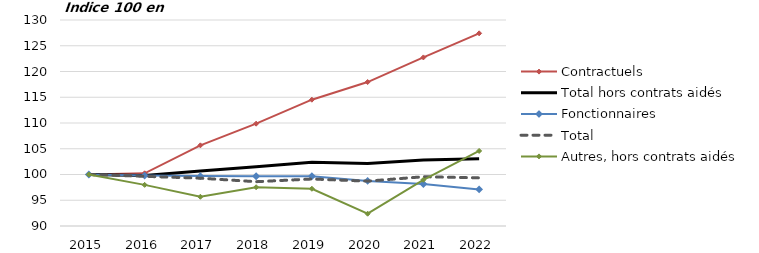
| Category | Contractuels | Total hors contrats aidés | Fonctionnaires | Total  | Autres, hors contrats aidés |
|---|---|---|---|---|---|
| 2015.0 | 100 | 100 | 100 | 100 | 100 |
| 2016.0 | 100.229 | 99.816 | 99.791 | 99.645 | 97.986 |
| 2017.0 | 105.657 | 100.684 | 99.69 | 99.283 | 95.675 |
| 2018.0 | 109.87 | 101.513 | 99.66 | 98.604 | 97.53 |
| 2019.0 | 114.53 | 102.379 | 99.657 | 99.122 | 97.232 |
| 2020.0 | 117.951 | 102.159 | 98.75 | 98.711 | 92.387 |
| 2021.0 | 122.736 | 102.811 | 98.158 | 99.564 | 98.973 |
| 2022.0 | 127.406 | 103.045 | 97.098 | 99.346 | 104.577 |